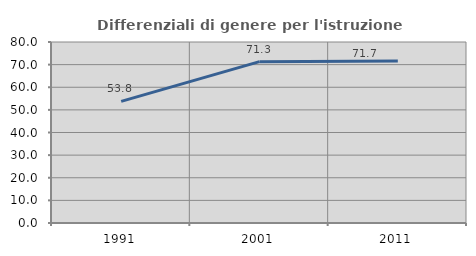
| Category | Differenziali di genere per l'istruzione superiore |
|---|---|
| 1991.0 | 53.757 |
| 2001.0 | 71.318 |
| 2011.0 | 71.651 |